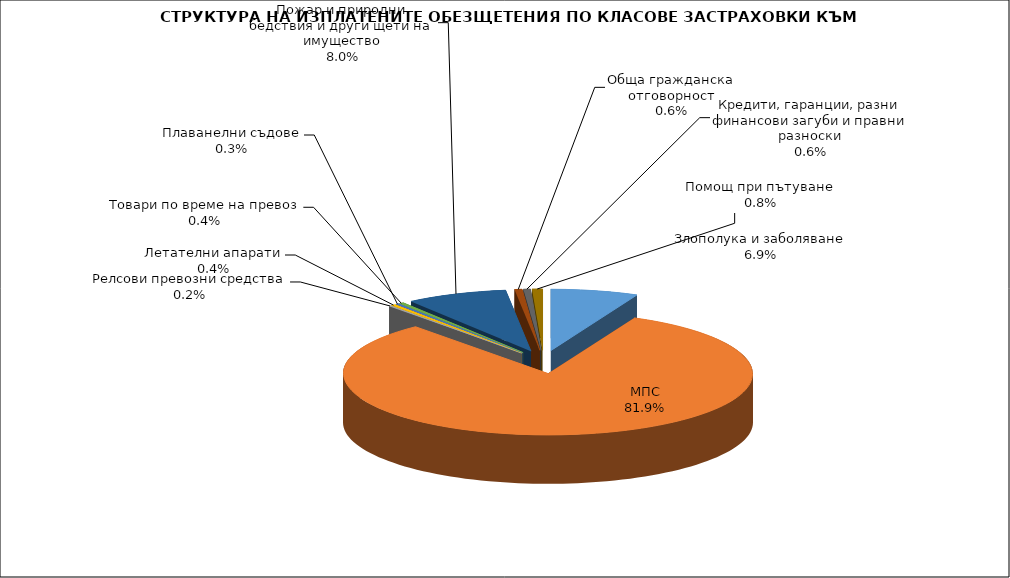
| Category | Злополука и заболяване |
|---|---|
| Злополука и заболяване | 0.069 |
| МПС | 0.819 |
| Релсови превозни средства | 0.002 |
| Летателни апарати | 0.004 |
| Плаванелни съдове | 0.003 |
| Товари по време на превоз | 0.004 |
| Пожар и природни бедствия и други щети на имущество | 0.08 |
| Обща гражданска отговорност | 0.006 |
| Кредити, гаранции, разни финансови загуби и правни разноски | 0.006 |
| Помощ при пътуване | 0.008 |